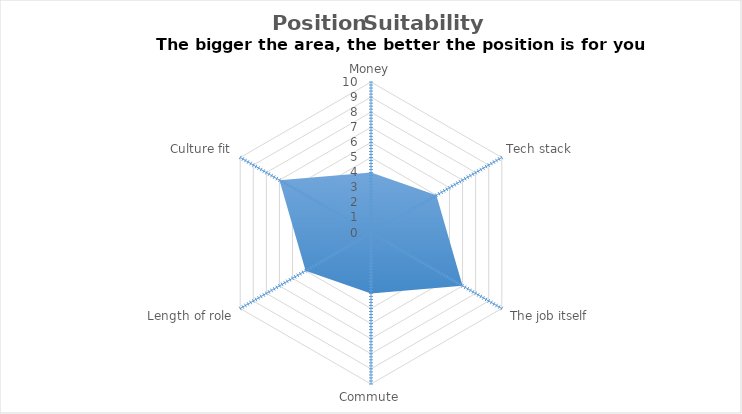
| Category | Series 0 |
|---|---|
| Money | 4 |
| Tech stack | 5 |
|  The job itself | 7 |
| Commute | 4 |
| Length of role | 5 |
| Culture fit | 7 |